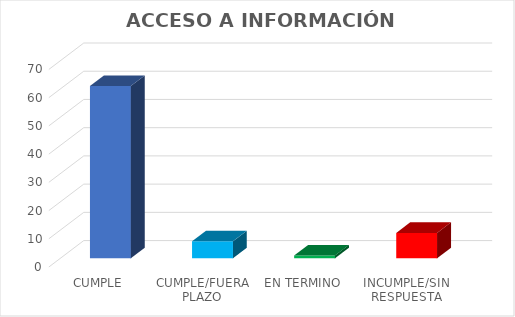
| Category | TOTAL |
|---|---|
| CUMPLE | 61 |
| CUMPLE/FUERA PLAZO | 6 |
| EN TERMINO | 1 |
| INCUMPLE/SIN RESPUESTA | 9 |